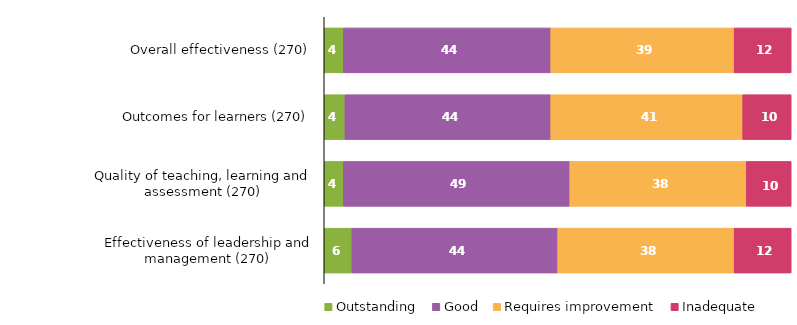
| Category | Outstanding | Good | Requires improvement | Inadequate |
|---|---|---|---|---|
| Overall effectiveness (270) | 4.074 | 44.444 | 39.259 | 12.222 |
| Outcomes for learners (270) | 4.444 | 44.074 | 41.111 | 10.37 |
| Quality of teaching, learning and assessment (270) | 4.074 | 48.519 | 37.778 | 9.63 |
| Effectiveness of leadership and management (270) | 5.926 | 44.074 | 37.778 | 12.222 |